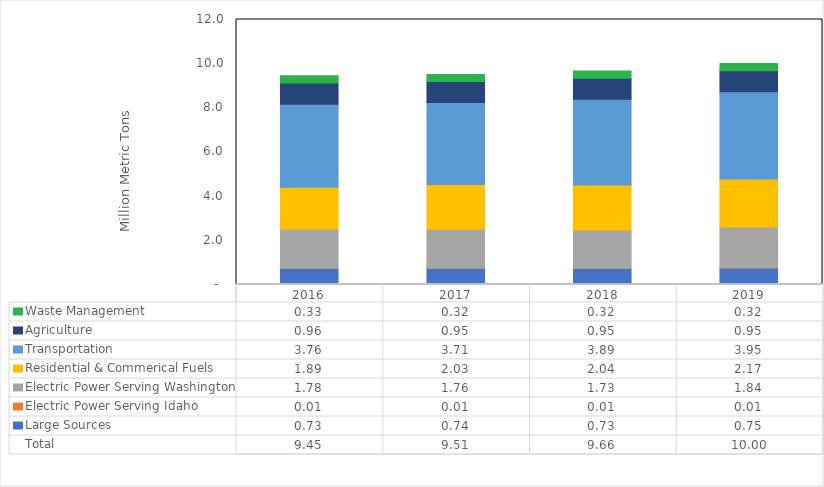
| Category | Large Sources | Electric Power Serving Idaho | Electric Power Serving Washington | Residential & Commerical Fuels | Transportation | Agriculture | Waste Management |
|---|---|---|---|---|---|---|---|
| 2016.0 | 0.733 | 0.005 | 1.778 | 1.891 | 3.759 | 0.958 | 0.325 |
| 2017.0 | 0.738 | 0.005 | 1.763 | 2.026 | 3.711 | 0.946 | 0.322 |
| 2018.0 | 0.733 | 0.006 | 1.732 | 2.036 | 3.887 | 0.948 | 0.321 |
| 2019.0 | 0.75 | 0.009 | 1.843 | 2.174 | 3.95 | 0.951 | 0.324 |